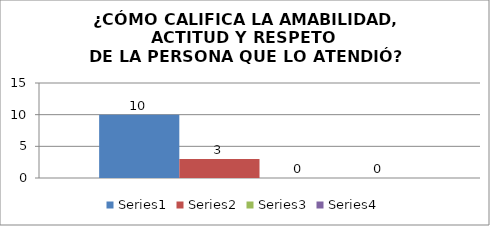
| Category | Series 0 | Series 1 | Series 2 | Series 3 |
|---|---|---|---|---|
| 0 | 10 | 3 | 0 | 0 |